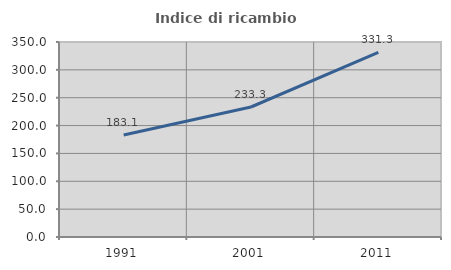
| Category | Indice di ricambio occupazionale  |
|---|---|
| 1991.0 | 183.099 |
| 2001.0 | 233.333 |
| 2011.0 | 331.25 |